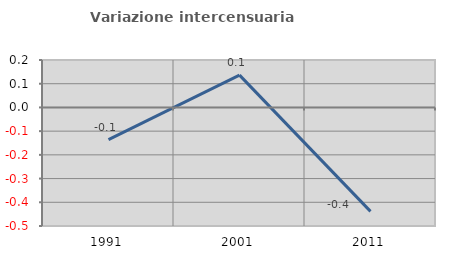
| Category | Variazione intercensuaria annua |
|---|---|
| 1991.0 | -0.136 |
| 2001.0 | 0.136 |
| 2011.0 | -0.438 |